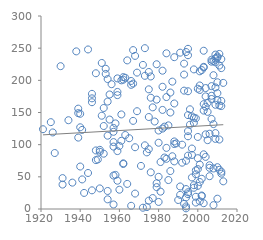
| Category | Series 0 |
|---|---|
| 1994.0 | 1 |
| 1972.0 | 2 |
| 1974.0 | 3 |
| 1994.0 | 4 |
| 1966.0 | 5 |
| 2008.0 | 6 |
| 1957.0 | 7 |
| 1993.0 | 8 |
| 2003.0 | 9 |
| 1999.0 | 10 |
| 1980.0 | 11 |
| 2001.0 | 12 |
| 1975.0 | 13 |
| 1990.0 | 14 |
| 1954.0 | 15 |
| 2010.0 | 16 |
| 1977.0 | 17 |
| 1994.0 | 18 |
| 1999.0 | 19 |
| 2002.0 | 20 |
| 2002.0 | 21 |
| 1991.0 | 22 |
| 1995.0 | 23 |
| 1968.0 | 24 |
| 1942.0 | 25 |
| 1995.0 | 26 |
| 1981.0 | 27 |
| 1954.0 | 28 |
| 1946.0 | 29 |
| 1960.0 | 30 |
| 1994.0 | 31 |
| 1950.0 | 32 |
| 1998.0 | 33 |
| 1979.0 | 34 |
| 1991.0 | 35 |
| 2000.0 | 36 |
| 1998.0 | 37 |
| 1931.0 | 38 |
| 1964.0 | 39 |
| 1979.0 | 40 |
| 1936.0 | 41 |
| 2001.0 | 42 |
| 2013.0 | 43 |
| 1959.0 | 44 |
| 1985.0 | 45 |
| 1941.0 | 46 |
| 2002.0 | 47 |
| 1931.0 | 48 |
| 1997.0 | 49 |
| 1980.0 | 50 |
| 2006.0 | 51 |
| 1957.0 | 52 |
| 1958.0 | 53 |
| 1999.0 | 54 |
| 2012.0 | 55 |
| 1944.0 | 56 |
| 1976.0 | 57 |
| 2012.0 | 58 |
| 1986.0 | 59 |
| 1999.0 | 60 |
| 2011.0 | 61 |
| 2000.0 | 62 |
| 2008.0 | 63 |
| 2006.0 | 64 |
| 2010.0 | 65 |
| 1940.0 | 66 |
| 1971.0 | 67 |
| 2006.0 | 68 |
| 2001.0 | 69 |
| 1962.0 | 70 |
| 1962.0 | 71 |
| 1992.0 | 72 |
| 1981.0 | 73 |
| 1988.0 | 74 |
| 1994.0 | 75 |
| 1948.0 | 76 |
| 1949.0 | 77 |
| 1984.0 | 78 |
| 2000.0 | 79 |
| 1983.0 | 80 |
| 2004.0 | 81 |
| 1987.0 | 82 |
| 1995.0 | 83 |
| 1997.0 | 84 |
| 2003.0 | 85 |
| 1952.0 | 86 |
| 1927.0 | 87 |
| 1974.0 | 88 |
| 1950.0 | 89 |
| 1959.0 | 90 |
| 1948.0 | 91 |
| 1950.0 | 92 |
| 1975.0 | 93 |
| 1997.0 | 94 |
| 1984.0 | 95 |
| 1968.0 | 96 |
| 1957.0 | 97 |
| 1960.0 | 98 |
| 1973.0 | 99 |
| 1992.0 | 100 |
| 1988.0 | 101 |
| 1989.0 | 102 |
| 1980.0 | 103 |
| 1957.0 | 104 |
| 1988.0 | 105 |
| 1961.0 | 106 |
| 2005.0 | 107 |
| 2011.0 | 108 |
| 2009.0 | 109 |
| 1965.0 | 110 |
| 1939.0 | 111 |
| 2000.0 | 112 |
| 1995.0 | 113 |
| 1954.0 | 114 |
| 1963.0 | 115 |
| 2004.0 | 116 |
| 2006.0 | 117 |
| 2009.0 | 118 |
| 1926.0 | 119 |
| 1957.0 | 120 |
| 1995.0 | 121 |
| 1980.0 | 122 |
| 1941.0 | 123 |
| 1921.0 | 124 |
| 1982.0 | 125 |
| 1957.0 | 126 |
| 1940.0 | 127 |
| 1983.0 | 128 |
| 1952.0 | 129 |
| 1985.0 | 130 |
| 1996.0 | 131 |
| 2008.0 | 132 |
| 1958.0 | 133 |
| 1998.0 | 134 |
| 1925.0 | 135 |
| 1978.0 | 136 |
| 1967.0 | 137 |
| 1934.0 | 138 |
| 1955.0 | 139 |
| 2007.0 | 140 |
| 1999.0 | 141 |
| 1998.0 | 142 |
| 1975.0 | 143 |
| 1997.0 | 144 |
| 1951.0 | 145 |
| 1995.0 | 146 |
| 1961.0 | 147 |
| 1940.0 | 148 |
| 1939.0 | 149 |
| 1986.0 | 150 |
| 2005.0 | 151 |
| 1969.0 | 152 |
| 2003.0 | 153 |
| 1982.0 | 154 |
| 1996.0 | 155 |
| 1939.0 | 156 |
| 1952.0 | 157 |
| 1977.0 | 158 |
| 2004.0 | 159 |
| 2012.0 | 160 |
| 2011.0 | 161 |
| 2009.0 | 162 |
| 2003.0 | 163 |
| 1988.0 | 164 |
| 2005.0 | 165 |
| 1946.0 | 166 |
| 1954.0 | 167 |
| 2012.0 | 168 |
| 2010.0 | 169 |
| 1979.0 | 170 |
| 2007.0 | 171 |
| 1946.0 | 172 |
| 1976.0 | 173 |
| 1984.0 | 174 |
| 2004.0 | 175 |
| 2007.0 | 176 |
| 1959.0 | 177 |
| 1955.0 | 178 |
| 1946.0 | 179 |
| 2010.0 | 180 |
| 1986.0 | 181 |
| 1959.0 | 182 |
| 1995.0 | 183 |
| 1993.0 | 184 |
| 2001.0 | 185 |
| 1975.0 | 186 |
| 2000.0 | 187 |
| 2004.0 | 188 |
| 2009.0 | 189 |
| 1982.0 | 190 |
| 2007.0 | 191 |
| 2001.0 | 192 |
| 1966.0 | 193 |
| 1956.0 | 194 |
| 1967.0 | 195 |
| 2013.0 | 196 |
| 2010.0 | 197 |
| 1987.0 | 198 |
| 1966.0 | 199 |
| 1961.0 | 200 |
| 1962.0 | 201 |
| 1954.0 | 202 |
| 1959.0 | 203 |
| 1963.0 | 204 |
| 1962.0 | 205 |
| 1976.0 | 206 |
| 1973.0 | 207 |
| 2008.0 | 208 |
| 1993.0 | 209 |
| 1953.0 | 210 |
| 1948.0 | 211 |
| 1969.0 | 212 |
| 1975.0 | 213 |
| 2001.0 | 214 |
| 1982.0 | 215 |
| 2002.0 | 216 |
| 1998.0 | 217 |
| 1953.0 | 218 |
| 2012.0 | 219 |
| 2003.0 | 220 |
| 2003.0 | 221 |
| 1930.0 | 222 |
| 2011.0 | 223 |
| 1972.0 | 224 |
| 1979.0 | 225 |
| 1993.0 | 226 |
| 1951.0 | 227 |
| 2009.0 | 228 |
| 2007.0 | 229 |
| 2008.0 | 230 |
| 1964.0 | 231 |
| 2007.0 | 232 |
| 2012.0 | 233 |
| 2009.0 | 234 |
| 2010.0 | 235 |
| 1988.0 | 236 |
| 2010.0 | 237 |
| 1968.0 | 238 |
| 1995.0 | 239 |
| 2009.0 | 240 |
| 2011.0 | 241 |
| 1984.0 | 242 |
| 1991.0 | 243 |
| 1994.0 | 244 |
| 1938.0 | 245 |
| 2003.0 | 246 |
| 1967.0 | 247 |
| 1944.0 | 248 |
| 1995.0 | 249 |
| 1973.0 | 250 |